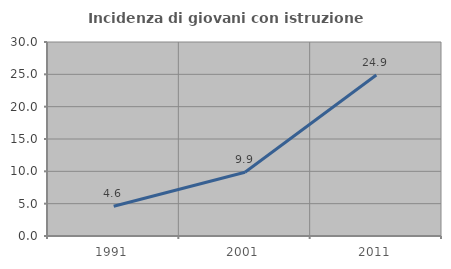
| Category | Incidenza di giovani con istruzione universitaria |
|---|---|
| 1991.0 | 4.608 |
| 2001.0 | 9.862 |
| 2011.0 | 24.899 |